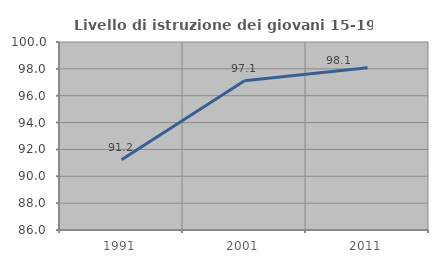
| Category | Livello di istruzione dei giovani 15-19 anni |
|---|---|
| 1991.0 | 91.233 |
| 2001.0 | 97.106 |
| 2011.0 | 98.075 |